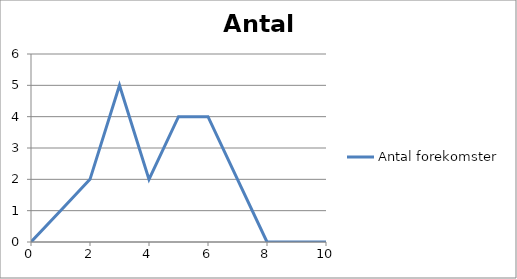
| Category | Antal forekomster |
|---|---|
| 0.0 | 0 |
| 1.0 | 1 |
| 2.0 | 2 |
| 3.0 | 5 |
| 4.0 | 2 |
| 5.0 | 4 |
| 6.0 | 4 |
| 7.0 | 2 |
| 8.0 | 0 |
| 9.0 | 0 |
| 10.0 | 0 |